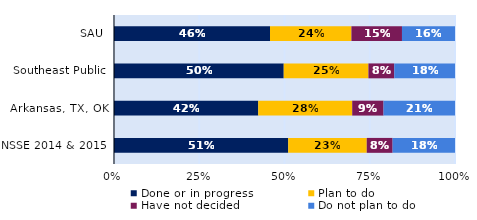
| Category | Done or in progress | Plan to do | Have not decided | Do not plan to do |
|---|---|---|---|---|
| SAU | 0.457 | 0.239 | 0.148 | 0.156 |
| Southeast Public | 0.498 | 0.248 | 0.076 | 0.178 |
| Arkansas, TX, OK | 0.423 | 0.276 | 0.092 | 0.21 |
| NSSE 2014 & 2015 | 0.511 | 0.23 | 0.076 | 0.183 |